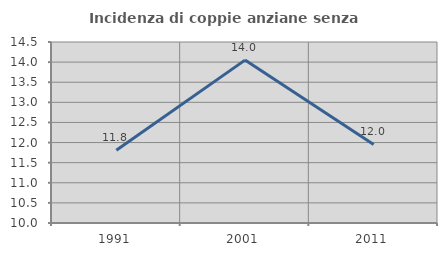
| Category | Incidenza di coppie anziane senza figli  |
|---|---|
| 1991.0 | 11.81 |
| 2001.0 | 14.05 |
| 2011.0 | 11.953 |